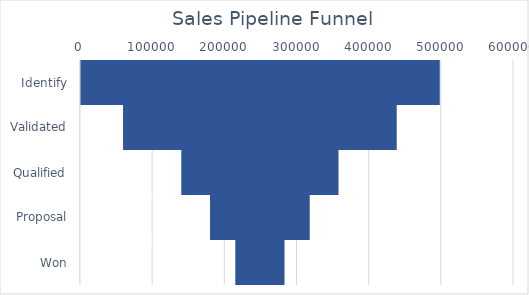
| Category | Series 0 | Series 1 |
|---|---|---|
| Identify | 0 | 498532 |
| Validated | 59647 | 379238 |
| Qualified | 140346 | 217840 |
| Proposal | 180191 | 138150 |
| Won | 215163.5 | 68205 |